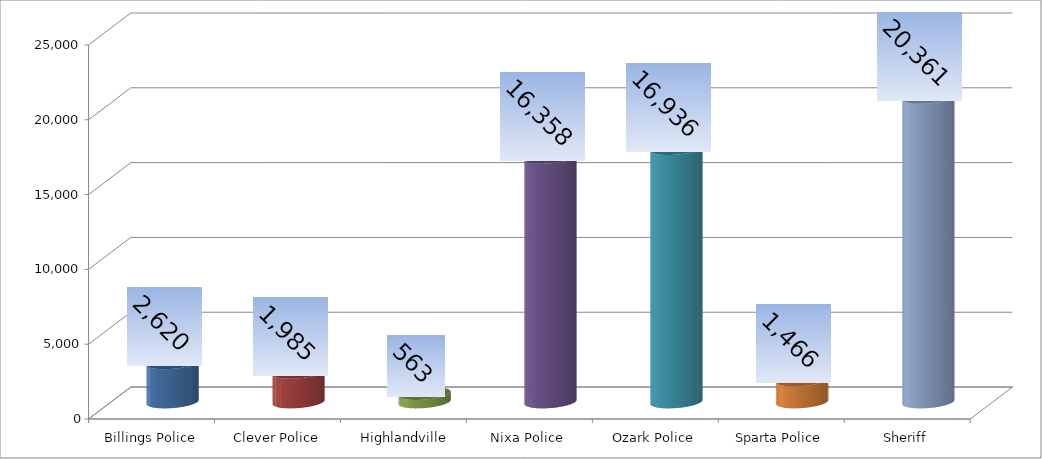
| Category | Series 0 |
|---|---|
| Billings Police | 2620 |
| Clever Police | 1985 |
| Highlandville Police | 563 |
| Nixa Police | 16358 |
| Ozark Police | 16936 |
| Sparta Police | 1466 |
| Sheriff | 20361 |